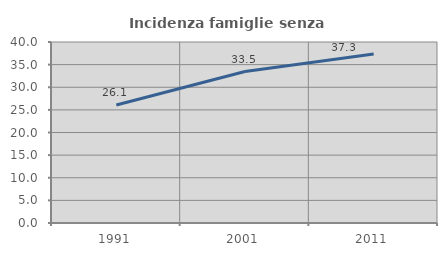
| Category | Incidenza famiglie senza nuclei |
|---|---|
| 1991.0 | 26.065 |
| 2001.0 | 33.469 |
| 2011.0 | 37.338 |